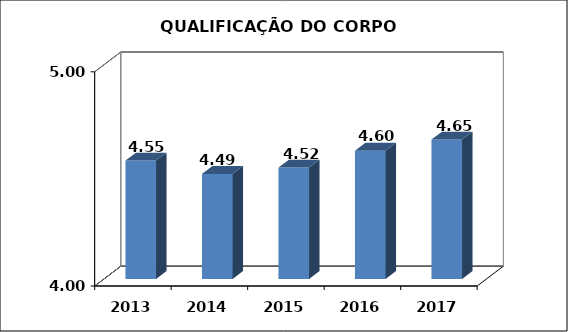
| Category | Series 0 |
|---|---|
| 2013.0 | 4.553 |
| 2014.0 | 4.49 |
| 2015.0 | 4.52 |
| 2016.0 | 4.599 |
| 2017.0 | 4.651 |